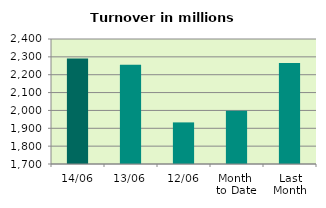
| Category | Series 0 |
|---|---|
| 14/06 | 2290.911 |
| 13/06 | 2255.74 |
| 12/06 | 1932.939 |
| Month 
to Date | 1998.32 |
| Last
Month | 2265.206 |